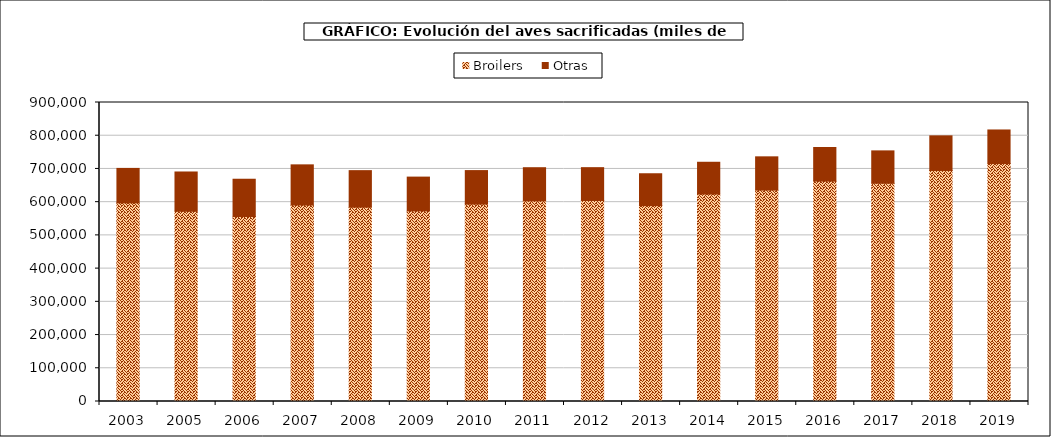
| Category | Broilers | Otras |
|---|---|---|
| 2003.0 | 597829.477 | 103757.125 |
| 2005.0 | 572648.744 | 118205.781 |
| 2006.0 | 556861.129 | 112149.283 |
| 2007.0 | 591393.726 | 120913.02 |
| 2008.0 | 584815.145 | 110075.473 |
| 2009.0 | 573771.704 | 101674.561 |
| 2010.0 | 594157.627 | 100908.152 |
| 2011.0 | 603746.997 | 99980.393 |
| 2012.0 | 604962.301 | 98903.042 |
| 2013.0 | 589666.337 | 95872.2 |
| 2014.0 | 624364.078 | 95729.779 |
| 2015.0 | 636311.721 | 100143.279 |
| 2016.0 | 663376.013 | 101162.185 |
| 2017.0 | 656846.042 | 97537.585 |
| 2018.0 | 695196.199 | 104409.425 |
| 2019.0 | 716259.103 | 101061.758 |